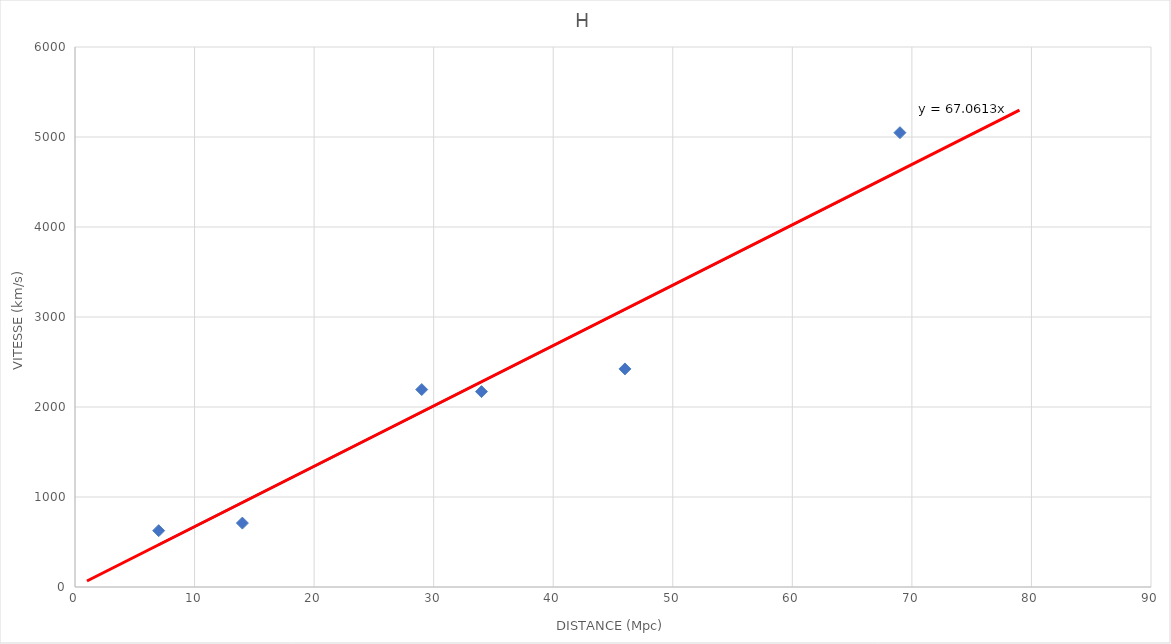
| Category | H |
|---|---|
| 29.0 | 2194 |
| 34.0 | 2171 |
| 46.0 | 2423 |
| 14.0 | 710 |
| 7.0 | 626 |
| 69.0 | 5048 |